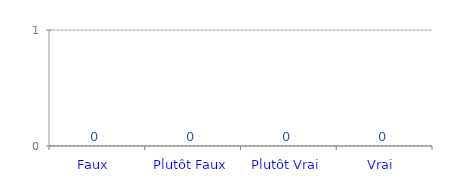
| Category | Véracité |
|---|---|
| Faux  | 0 |
| Plutôt Faux | 0 |
| Plutôt Vrai | 0 |
| Vrai  | 0 |